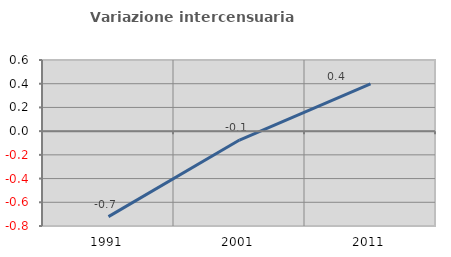
| Category | Variazione intercensuaria annua |
|---|---|
| 1991.0 | -0.721 |
| 2001.0 | -0.075 |
| 2011.0 | 0.398 |